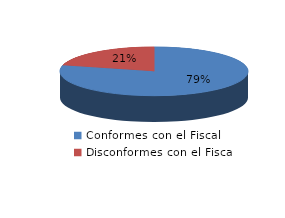
| Category | Series 0 |
|---|---|
| 0 | 105 |
| 1 | 28 |